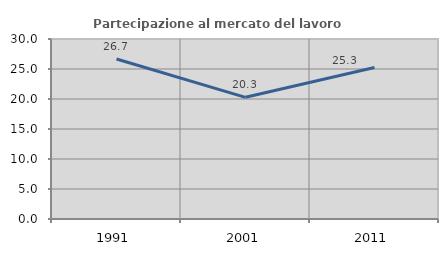
| Category | Partecipazione al mercato del lavoro  femminile |
|---|---|
| 1991.0 | 26.672 |
| 2001.0 | 20.278 |
| 2011.0 | 25.255 |